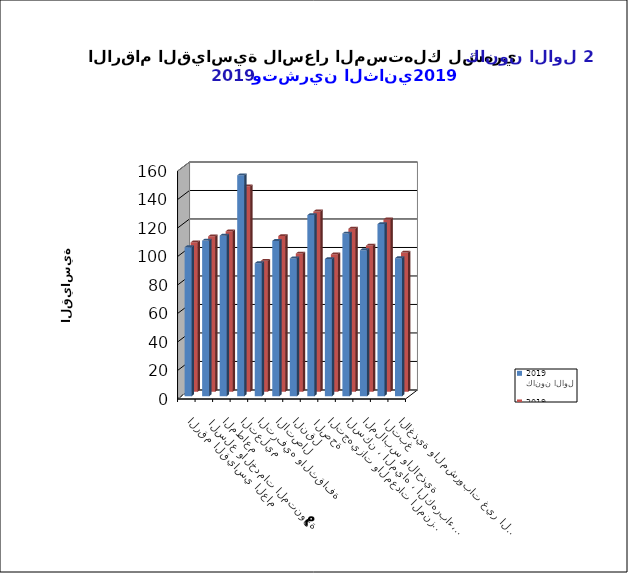
| Category | كانون الاول  2019      | تشرين الثاني 2019       |
|---|---|---|
| الاغذية والمشروبات غير الكحولية | 96.9 | 97.7 |
|  التبغ | 120.8 | 120.9 |
| الملابس والاحذية | 102.5 | 102.5 |
| السكن ، المياه ، الكهرباء، الغاز  | 114.2 | 114.4 |
| التجهيزات والمعدات المنزلية والصيانة | 96.3 | 96.4 |
|  الصحة | 127.1 | 126.5 |
| النقل | 96.7 | 97 |
| الاتصال | 109 | 109.2 |
| الترفيه والثقافة | 93.4 | 91.8 |
| التعليم | 155 | 144.2 |
| المطاعم  | 112.7 | 112.6 |
|  السلع والخدمات المتنوعة | 109.2 | 109 |
| الرقم القياسي العام | 104.6 | 104.8 |